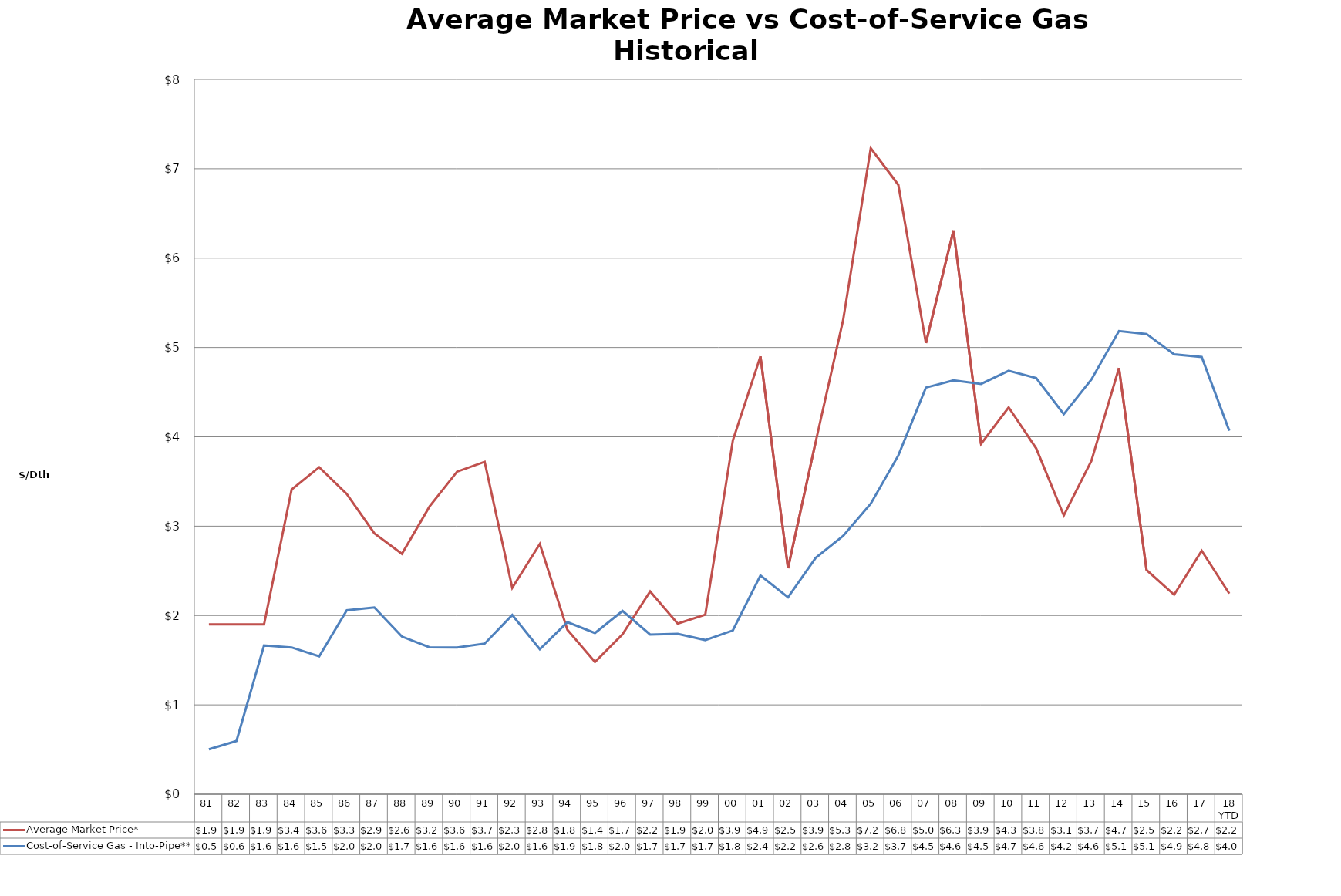
| Category | Average Market Price* | Cost-of-Service Gas - Into-Pipe** |
|---|---|---|
| 81 | 1.9 | 0.502 |
| 82 | 1.9 | 0.596 |
| 83 | 1.9 | 1.665 |
| 84 | 3.41 | 1.643 |
| 85 | 3.66 | 1.543 |
| 86 | 3.36 | 2.059 |
| 87 | 2.92 | 2.091 |
| 88 | 2.69 | 1.764 |
| 89 | 3.22 | 1.644 |
| 90 | 3.61 | 1.642 |
| 91 | 3.72 | 1.685 |
| 92 | 2.31 | 2.005 |
| 93 | 2.8 | 1.623 |
| 94 | 1.84 | 1.926 |
| 95 | 1.48 | 1.804 |
| 96 | 1.79 | 2.052 |
| 97 | 2.27 | 1.787 |
| 98 | 1.91 | 1.795 |
| 99 | 2.01 | 1.725 |
| 00 | 3.96 | 1.833 |
| 01 | 4.9 | 2.448 |
| 02 | 2.53 | 2.204 |
| 03 | 3.94 | 2.644 |
| 04 | 5.31 | 2.891 |
| 05 | 7.23 | 3.251 |
| 06 | 6.82 | 3.792 |
| 07 | 5.05 | 4.551 |
| 08 | 6.31 | 4.632 |
| 09 | 3.92 | 4.592 |
| 10 | 4.33 | 4.74 |
| 11 | 3.87 | 4.658 |
| 12 | 3.12 | 4.253 |
| 13 | 3.73 | 4.641 |
| 14 | 4.77 | 5.184 |
| 15 | 2.51 | 5.151 |
| 16 | 2.233 | 4.923 |
| 17 | 2.725 | 4.894 |
| 18 YTD | 2.246 | 4.068 |